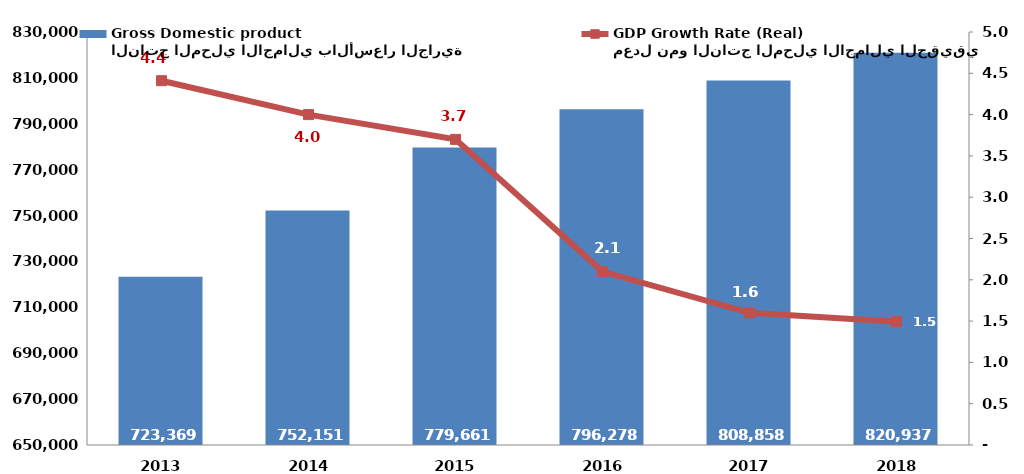
| Category | الناتج المحلي الاجمالي بالأسعار الجارية
Gross Domestic product |
|---|---|
| 2013 | 723368.62 |
| 2014 | 752151 |
| 2015 | 779661 |
| 2016 | 796278 |
| 2017 | 808858 |
| 2018 | 820937.314 |